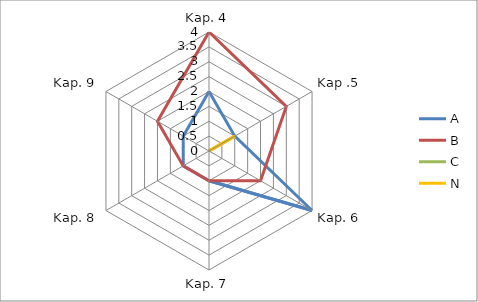
| Category | A | B | C | N |
|---|---|---|---|---|
| Kap. 4 | 2 | 4 | 0 | 0 |
| Kap .5 | 1 | 3 | 0 | 1 |
| Kap. 6 | 4 | 2 | 0 | 0 |
| Kap. 7 | 1 | 1 | 0 | 0 |
| Kap. 8 | 1 | 1 | 0 | 0 |
| Kap. 9 | 1 | 2 | 0 | 0 |